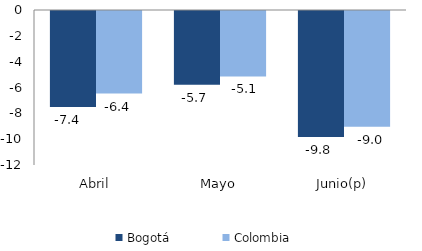
| Category | Bogotá | Colombia |
|---|---|---|
| Abril | -7.436 | -6.388 |
| Mayo | -5.709 | -5.063 |
| Junio(p) | -9.758 | -8.959 |